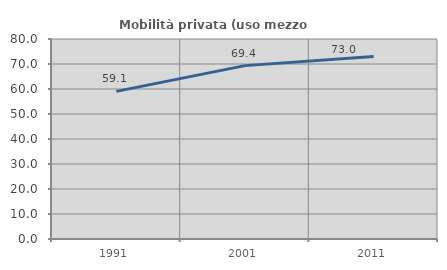
| Category | Mobilità privata (uso mezzo privato) |
|---|---|
| 1991.0 | 59.059 |
| 2001.0 | 69.351 |
| 2011.0 | 73.023 |